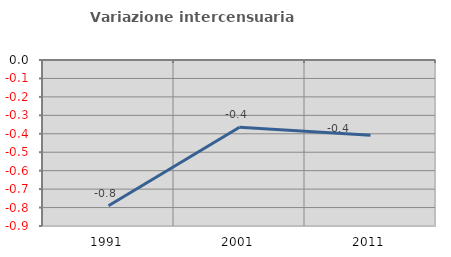
| Category | Variazione intercensuaria annua |
|---|---|
| 1991.0 | -0.79 |
| 2001.0 | -0.365 |
| 2011.0 | -0.408 |